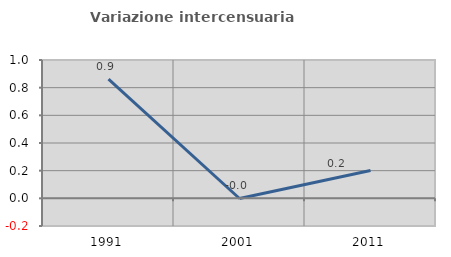
| Category | Variazione intercensuaria annua |
|---|---|
| 1991.0 | 0.862 |
| 2001.0 | -0.001 |
| 2011.0 | 0.202 |